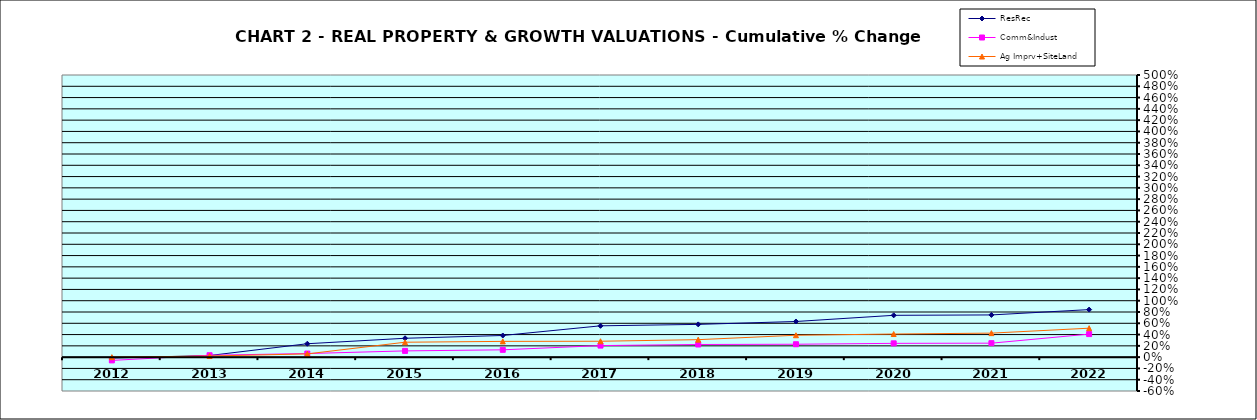
| Category | ResRec | Comm&Indust | Ag Imprv+SiteLand |
|---|---|---|---|
| 2012.0 | -0.017 | -0.058 | 0 |
| 2013.0 | 0.029 | 0.034 | 0.02 |
| 2014.0 | 0.238 | 0.064 | 0.058 |
| 2015.0 | 0.334 | 0.111 | 0.264 |
| 2016.0 | 0.384 | 0.13 | 0.279 |
| 2017.0 | 0.555 | 0.205 | 0.282 |
| 2018.0 | 0.581 | 0.224 | 0.31 |
| 2019.0 | 0.632 | 0.229 | 0.388 |
| 2020.0 | 0.741 | 0.245 | 0.41 |
| 2021.0 | 0.748 | 0.247 | 0.425 |
| 2022.0 | 0.843 | 0.408 | 0.513 |